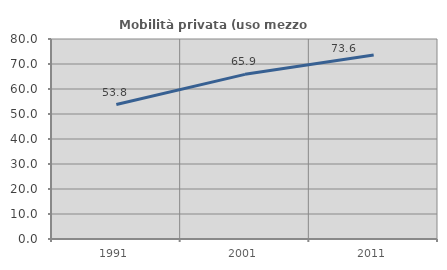
| Category | Mobilità privata (uso mezzo privato) |
|---|---|
| 1991.0 | 53.799 |
| 2001.0 | 65.864 |
| 2011.0 | 73.57 |